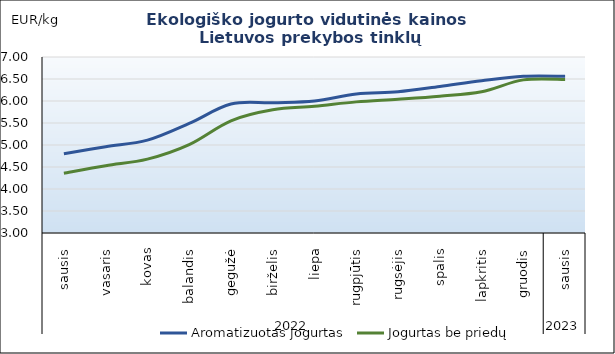
| Category | Aromatizuotas jogurtas | Jogurtas be priedų |
|---|---|---|
| 0 | 4.8 | 4.36 |
| 1 | 4.96 | 4.53 |
| 2 | 5.11 | 4.68 |
| 3 | 5.49 | 5.01 |
| 4 | 5.93 | 5.55 |
| 5 | 5.96 | 5.8 |
| 6 | 6 | 5.88 |
| 7 | 6.16 | 5.98 |
| 8 | 6.21 | 6.04 |
| 9 | 6.33 | 6.11 |
| 10 | 6.46 | 6.21 |
| 11 | 6.56 | 6.48 |
| 12 | 6.56 | 6.49 |